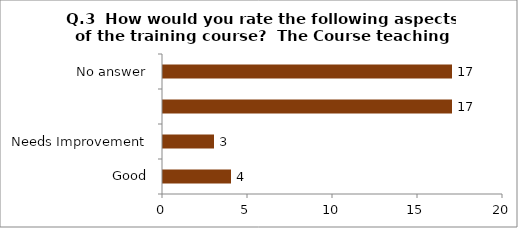
| Category | Q.3  How would you rate the following aspects of the training course?  The Course teaching hours |
|---|---|
| Good | 4 |
| Needs Improvement | 3 |
|  | 17 |
| No answer | 17 |